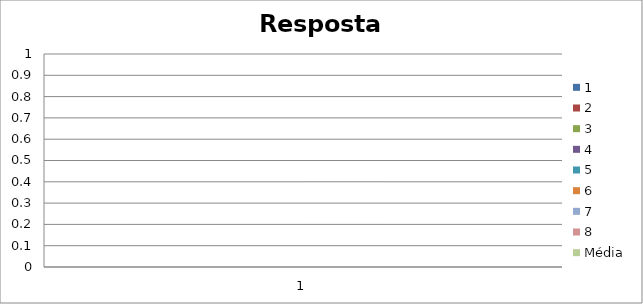
| Category | 1 | 2 | 3 | 4 | 5 | 6 | 7 | 8 | Média |
|---|---|---|---|---|---|---|---|---|---|
| 0 | 0 | 0 | 0 | 0 | 0 | 0 | 0 | 0 | 0 |